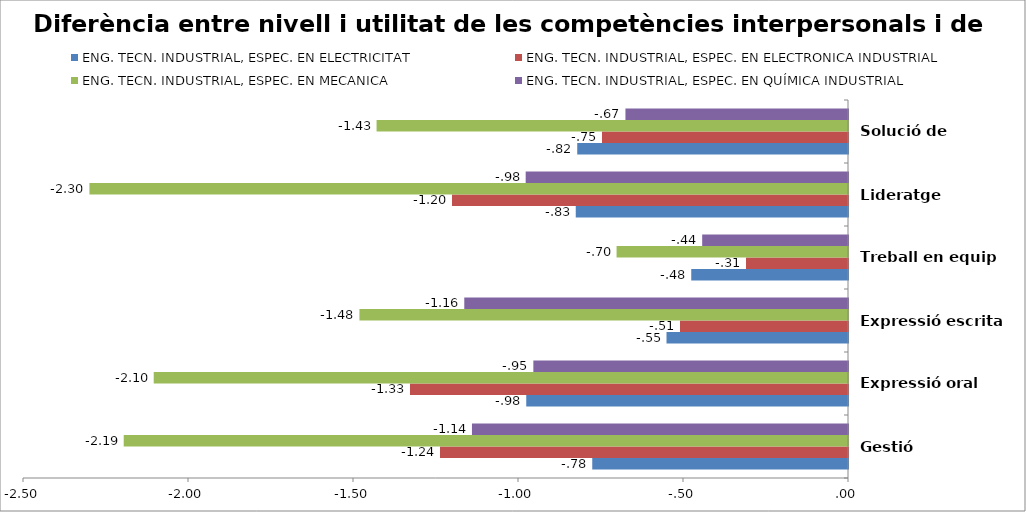
| Category | ENG. TECN. INDUSTRIAL, ESPEC. EN ELECTRICITAT | ENG. TECN. INDUSTRIAL, ESPEC. EN ELECTRONICA INDUSTRIAL | ENG. TECN. INDUSTRIAL, ESPEC. EN MECANICA | ENG. TECN. INDUSTRIAL, ESPEC. EN QUÍMICA INDUSTRIAL |
|---|---|---|---|---|
| Gestió | -0.775 | -1.236 | -2.195 | -1.14 |
| Expressió oral | -0.975 | -1.327 | -2.104 | -0.953 |
| Expressió escrita | -0.55 | -0.509 | -1.481 | -1.163 |
| Treball en equip | -0.475 | -0.309 | -0.701 | -0.442 |
| Lideratge | -0.825 | -1.2 | -2.299 | -0.977 |
| Solució de prombles | -0.821 | -0.745 | -1.429 | -0.674 |